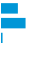
| Category | Series 0 |
|---|---|
| 0 | 0.397 |
| 1 | 0.589 |
| 2 | 0.014 |
| 3 | 0 |